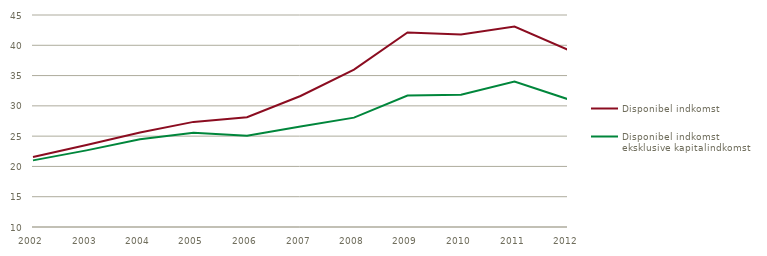
| Category | Disponibel indkomst | Disponibel indkomst 
eksklusive kapitalindkomst |
|---|---|---|
| 2002.0 | 21564 | 21000 |
| 2003.0 | 23541 | 22650 |
| 2004.0 | 25605 | 24474 |
| 2005.0 | 27354 | 25545 |
| 2006.0 | 28131 | 25077 |
| 2007.0 | 31629 | 26604 |
| 2008.0 | 35982 | 28053 |
| 2009.0 | 42105 | 31698 |
| 2010.0 | 41793 | 31830 |
| 2011.0 | 43089 | 34014 |
| 2012.0 | 39246 | 31107 |